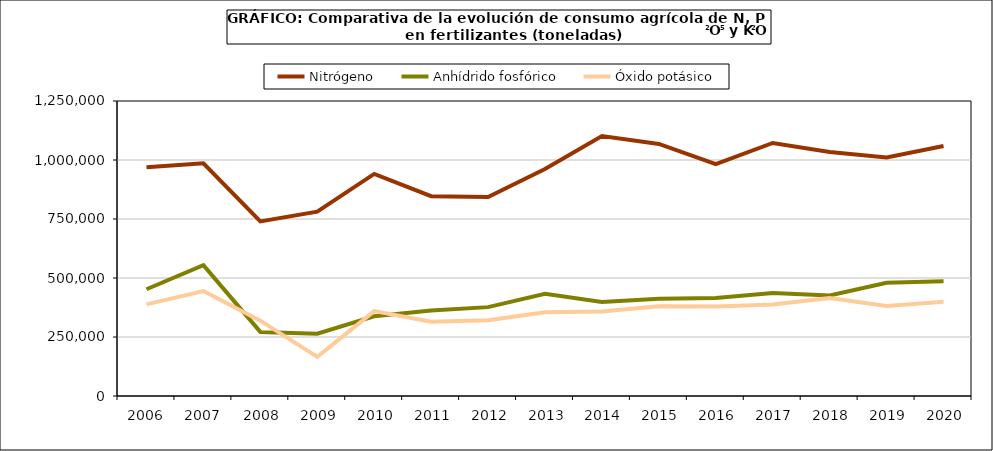
| Category | Nitrógeno | Anhídrido fosfórico | Óxido potásico |
|---|---|---|---|
|   2006  | 969783 | 452461 | 388187 |
|   2007  | 985857 | 554382 | 444853 |
|   2008 | 739757 | 271578 | 319194 |
|   2009 | 781069 | 264211 | 166016 |
|   2010 | 940984 | 337812 | 359583 |
|   2011 | 846697 | 362672 | 314642 |
|   2012 | 843410 | 376590 | 320841 |
|   2013 | 961507 | 432904 | 354738 |
|   2014 | 1101895 | 398580 | 357875 |
|   2015 | 1068103 | 411763 | 380303 |
|   2016 | 982155 | 414974 | 379007 |
|   2017 | 1072125 | 436110 | 387885 |
|   2018 | 1033494 | 425960 | 414675 |
|   2019 | 1010578 | 479562 | 381566 |
|   2020 | 1059299 | 486618 | 399379 |